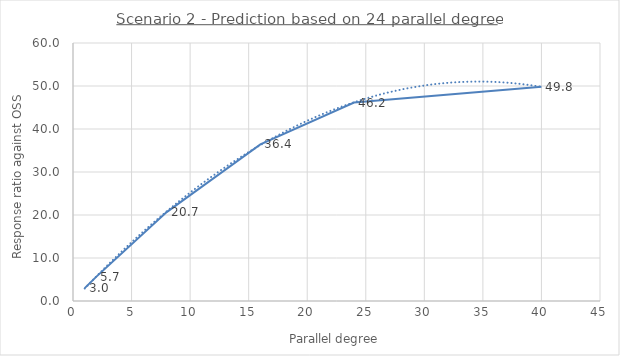
| Category | Series 0 |
|---|---|
| 1.0 | 2.996 |
| 2.0 | 5.672 |
| 8.0 | 20.68 |
| 16.0 | 36.429 |
| 24.0 | 46.153 |
| 40.0 | 49.803 |